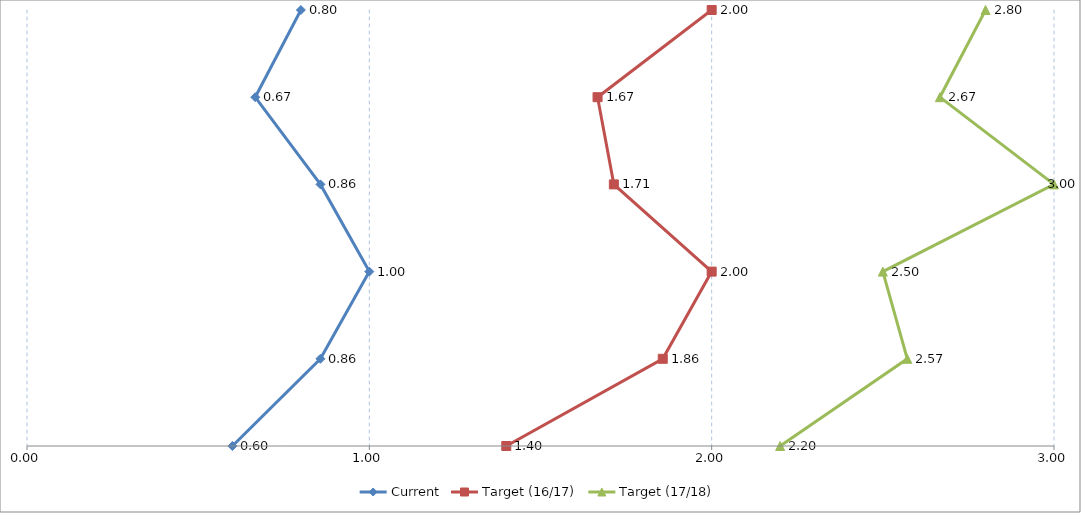
| Category | Series 4 |
|---|---|
| 1. Strategy & Organisation | 3 |
| 2. People & Skills | 3 |
| 3. Strategic Procurement | 3 |
| 4. Supply Chain | 3 |
| 5. Data, Systems and Performance Management | 3 |
| 6. Policies & Procedures | 3 |